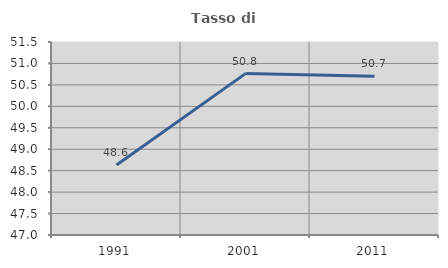
| Category | Tasso di occupazione   |
|---|---|
| 1991.0 | 48.631 |
| 2001.0 | 50.763 |
| 2011.0 | 50.7 |